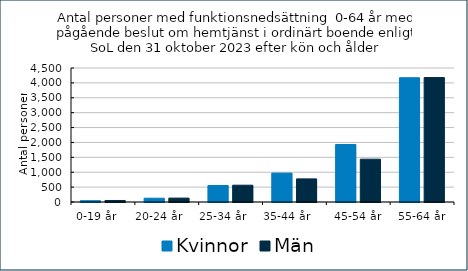
| Category | Kvinnor | Män  |
|---|---|---|
| 0-19 år    | 44 | 51 |
| 20-24 år       | 127 | 131 |
| 25-34 år      | 554 | 564 |
| 35-44 år        | 971 | 776 |
| 45-54 år | 1930 | 1438 |
| 55-64 år | 4173 | 4179 |